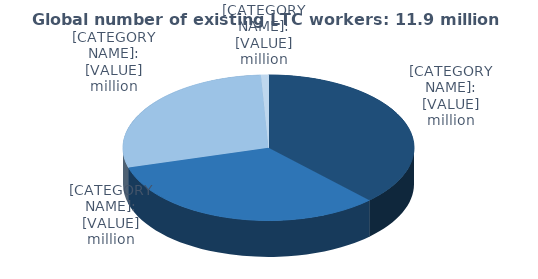
| Category | Global number of existing LTC workers: 11.9 million |
|---|---|
| Asia and the Pacific | 4.5 |
| Europe | 3.9 |
| Americas  | 3.4 |
| Africa | 0.1 |